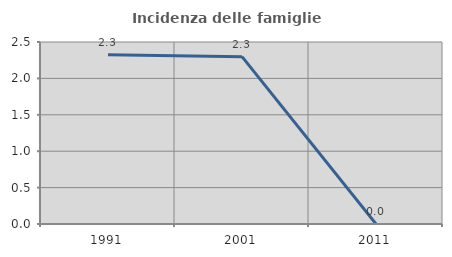
| Category | Incidenza delle famiglie numerose |
|---|---|
| 1991.0 | 2.326 |
| 2001.0 | 2.299 |
| 2011.0 | 0 |